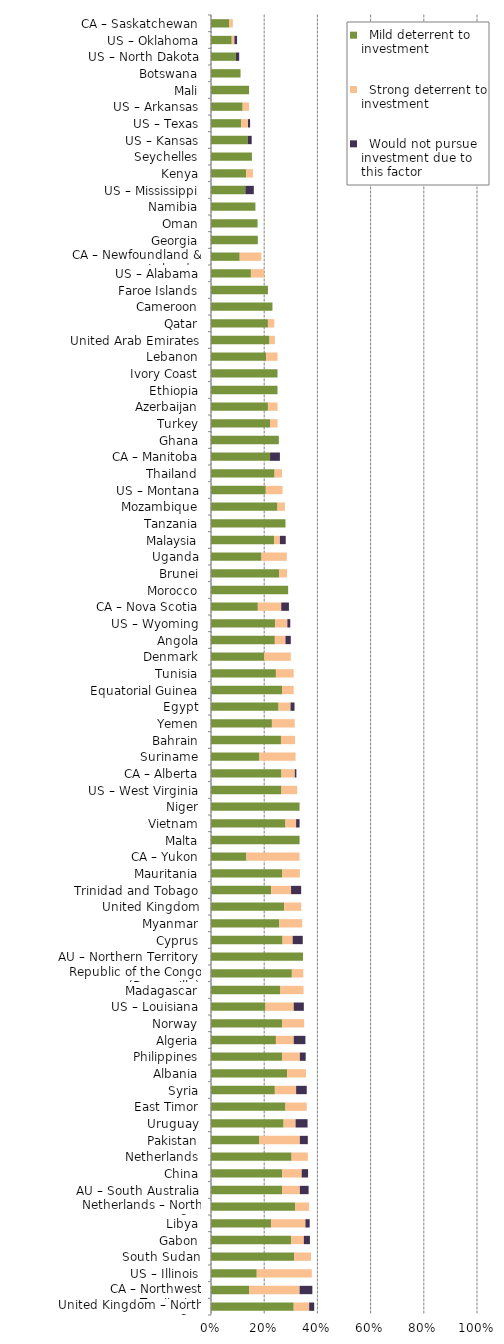
| Category |   Mild deterrent to investment |   Strong deterrent to investment |   Would not pursue investment due to this factor |
|---|---|---|---|
| United Kingdom – North Sea | 0.311 | 0.058 | 0.019 |
| CA – Northwest Territories | 0.143 | 0.19 | 0.048 |
| US – Illinois | 0.172 | 0.207 | 0 |
| South Sudan | 0.313 | 0.063 | 0 |
| Gabon | 0.302 | 0.047 | 0.023 |
| Libya | 0.226 | 0.129 | 0.016 |
| Netherlands – North Sea | 0.316 | 0.053 | 0 |
| AU – South Australia | 0.267 | 0.067 | 0.033 |
| China | 0.268 | 0.073 | 0.024 |
| Netherlands | 0.303 | 0.061 | 0 |
| Pakistan | 0.182 | 0.152 | 0.03 |
| Uruguay | 0.273 | 0.045 | 0.045 |
| East Timor | 0.28 | 0.08 | 0 |
| Syria | 0.24 | 0.08 | 0.04 |
| Albania | 0.286 | 0.071 | 0 |
| Philippines | 0.267 | 0.067 | 0.022 |
| Algeria | 0.244 | 0.067 | 0.044 |
| Norway | 0.267 | 0.083 | 0 |
| US – Louisiana | 0.205 | 0.106 | 0.038 |
| Madagascar | 0.261 | 0.087 | 0 |
| Republic of the Congo (Brazzaville) | 0.304 | 0.043 | 0 |
| AU – Northern Territory | 0.346 | 0 | 0 |
| Cyprus | 0.269 | 0.038 | 0.038 |
| Myanmar | 0.257 | 0.086 | 0 |
| United Kingdom | 0.275 | 0.064 | 0 |
| Trinidad and Tobago | 0.226 | 0.075 | 0.038 |
| Mauritania | 0.267 | 0.067 | 0 |
| CA – Yukon | 0.133 | 0.2 | 0 |
| Malta | 0.333 | 0 | 0 |
| Vietnam | 0.28 | 0.04 | 0.013 |
| Niger | 0.333 | 0 | 0 |
| US – West Virginia | 0.265 | 0.059 | 0 |
| CA – Alberta | 0.265 | 0.05 | 0.006 |
| Suriname | 0.182 | 0.136 | 0 |
| Bahrain | 0.263 | 0.053 | 0 |
| Yemen | 0.229 | 0.086 | 0 |
| Egypt | 0.254 | 0.045 | 0.015 |
| Equatorial Guinea | 0.267 | 0.044 | 0 |
| Tunisia | 0.244 | 0.067 | 0 |
| Denmark | 0.2 | 0.1 | 0 |
| Angola | 0.24 | 0.04 | 0.02 |
| US – Wyoming | 0.241 | 0.046 | 0.011 |
| CA – Nova Scotia | 0.176 | 0.088 | 0.029 |
| Morocco | 0.29 | 0 | 0 |
| Brunei | 0.257 | 0.029 | 0 |
| Uganda | 0.19 | 0.095 | 0 |
| Malaysia | 0.237 | 0.022 | 0.022 |
| Tanzania | 0.28 | 0 | 0 |
| Mozambique | 0.25 | 0.028 | 0 |
| US – Montana | 0.206 | 0.063 | 0 |
| Thailand | 0.239 | 0.028 | 0 |
| CA – Manitoba | 0.222 | 0 | 0.037 |
| Ghana | 0.255 | 0 | 0 |
| Turkey | 0.222 | 0.028 | 0 |
| Azerbaijan | 0.214 | 0.036 | 0 |
| Ethiopia | 0.25 | 0 | 0 |
| Ivory Coast | 0.25 | 0 | 0 |
| Lebanon | 0.208 | 0.042 | 0 |
| United Arab Emirates | 0.22 | 0.02 | 0 |
| Qatar | 0.214 | 0.024 | 0 |
| Cameroon | 0.231 | 0 | 0 |
| Faroe Islands | 0.214 | 0 | 0 |
| US – Alabama | 0.15 | 0.05 | 0 |
| CA – Newfoundland & Labrador | 0.108 | 0.081 | 0 |
| Georgia | 0.176 | 0 | 0 |
| Oman | 0.175 | 0 | 0 |
| Namibia | 0.167 | 0 | 0 |
| US – Mississippi | 0.129 | 0 | 0.032 |
| Kenya | 0.132 | 0.026 | 0 |
| Seychelles | 0.154 | 0 | 0 |
| US – Kansas | 0.139 | 0 | 0.014 |
| US – Texas | 0.114 | 0.025 | 0.008 |
| US – Arkansas | 0.119 | 0.024 | 0 |
| Mali | 0.143 | 0 | 0 |
| Botswana | 0.111 | 0 | 0 |
| US – North Dakota | 0.093 | 0 | 0.013 |
| US – Oklahoma | 0.078 | 0.01 | 0.01 |
| CA – Saskatchewan | 0.068 | 0.014 | 0 |